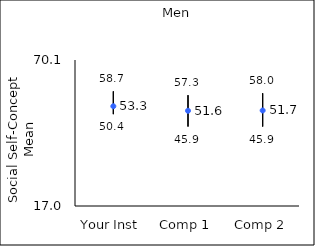
| Category | 25th percentile | 75th percentile | Mean |
|---|---|---|---|
| Your Inst | 50.4 | 58.7 | 53.28 |
| Comp 1 | 45.9 | 57.3 | 51.63 |
| Comp 2 | 45.9 | 58 | 51.74 |